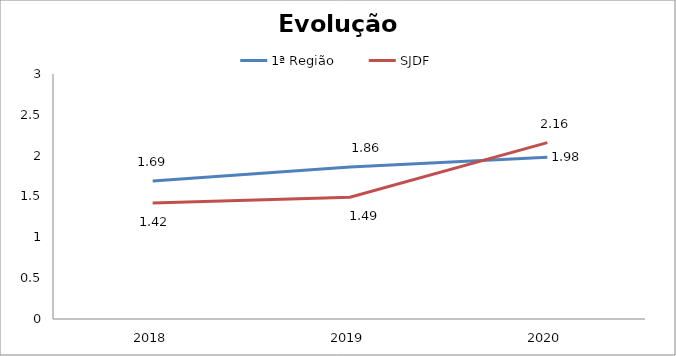
| Category | 1ª Região | SJDF |
|---|---|---|
| 0 | 1.69 | 1.42 |
| 1 | 1.86 | 1.49 |
| 2 | 1.98 | 2.16 |